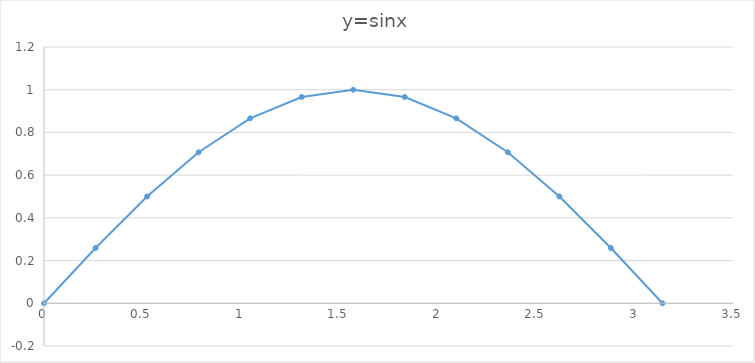
| Category | Series 0 |
|---|---|
| 0.0 | 0 |
| 0.2617993877991494 | 0.259 |
| 0.5235987755982988 | 0.5 |
| 0.7853981633974483 | 0.707 |
| 1.0471975511965976 | 0.866 |
| 1.308996938995747 | 0.966 |
| 1.5707963267948963 | 1 |
| 1.8325957145940457 | 0.966 |
| 2.0943951023931953 | 0.866 |
| 2.356194490192345 | 0.707 |
| 2.6179938779914944 | 0.5 |
| 2.879793265790644 | 0.259 |
| 3.1415926535897936 | 0 |